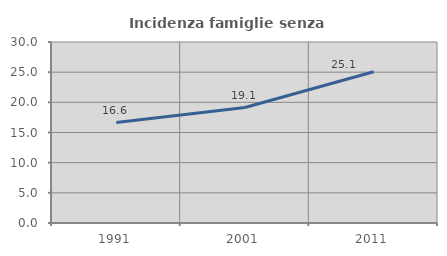
| Category | Incidenza famiglie senza nuclei |
|---|---|
| 1991.0 | 16.644 |
| 2001.0 | 19.139 |
| 2011.0 | 25.077 |